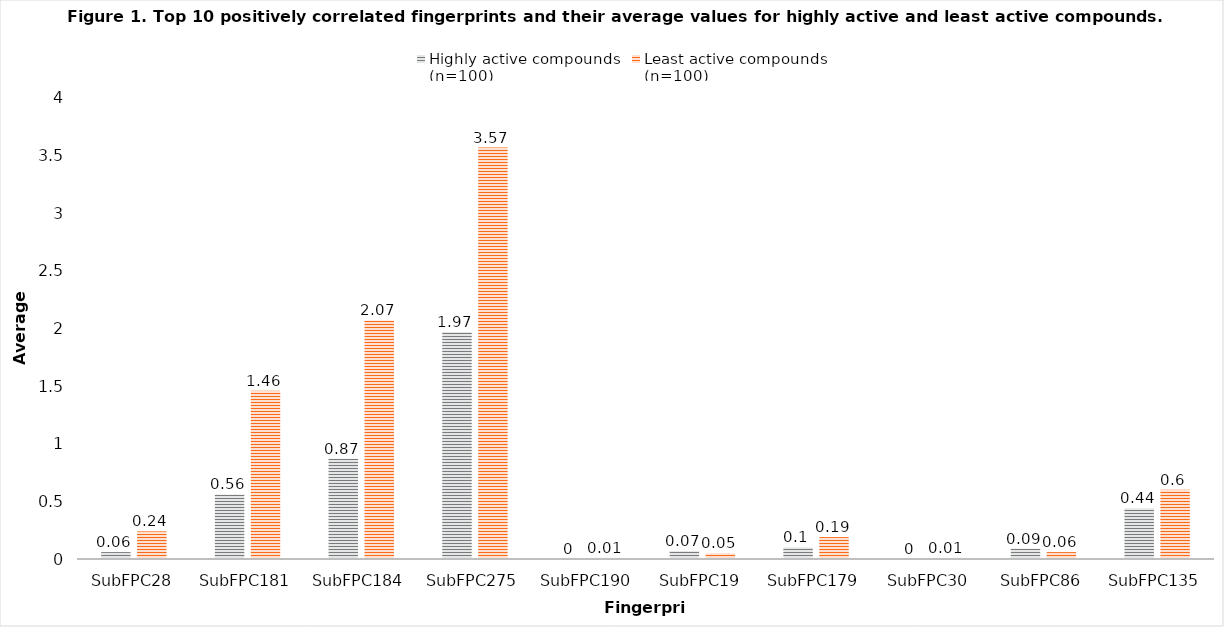
| Category | Highly active compounds 
(n=100) | Least active compounds 
(n=100) |
|---|---|---|
| SubFPC28 | 0.06 | 0.24 |
| SubFPC181 | 0.56 | 1.46 |
| SubFPC184 | 0.87 | 2.07 |
| SubFPC275 | 1.97 | 3.57 |
| SubFPC190 | 0 | 0.01 |
| SubFPC19 | 0.07 | 0.05 |
| SubFPC179 | 0.1 | 0.19 |
| SubFPC30 | 0 | 0.01 |
| SubFPC86 | 0.09 | 0.06 |
| SubFPC135 | 0.44 | 0.6 |